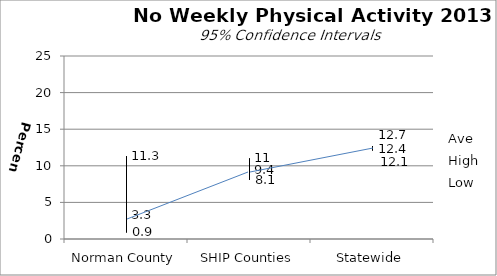
| Category | Ave | High | Low |
|---|---|---|---|
| Norman County | 3.3 | 11.3 | 0.9 |
| SHIP Counties | 9.4 | 11 | 8.1 |
| Statewide | 12.4 | 12.7 | 12.1 |